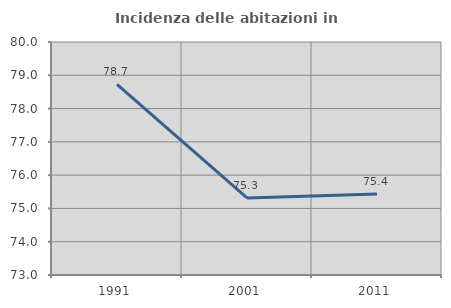
| Category | Incidenza delle abitazioni in proprietà  |
|---|---|
| 1991.0 | 78.723 |
| 2001.0 | 75.315 |
| 2011.0 | 75.433 |